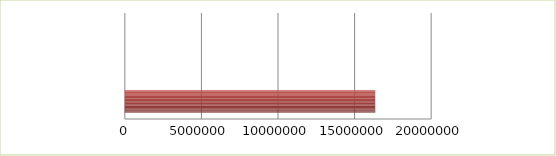
| Category | Series 0 | Series 1 |
|---|---|---|
| 0 | 2.5 | 16349254 |
| 1 | 2.6 | 0 |
| 2 | 2.7 | 0 |